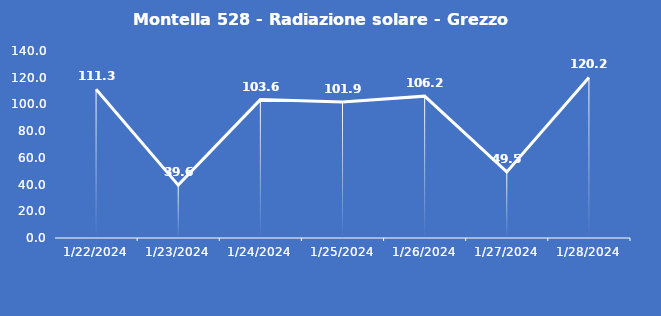
| Category | Montella 528 - Radiazione solare - Grezzo (W/m2) |
|---|---|
| 1/22/24 | 111.3 |
| 1/23/24 | 39.6 |
| 1/24/24 | 103.6 |
| 1/25/24 | 101.9 |
| 1/26/24 | 106.2 |
| 1/27/24 | 49.5 |
| 1/28/24 | 120.2 |